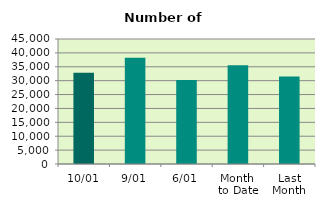
| Category | Series 0 |
|---|---|
| 10/01 | 32892 |
| 9/01 | 38230 |
| 6/01 | 30244 |
| Month 
to Date | 35551.143 |
| Last
Month | 31517.905 |